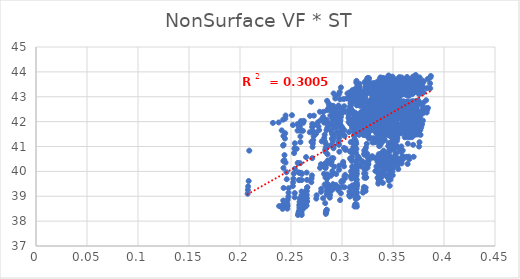
| Category | UTCI |
|---|---|
| 0.257492509 | 41.801 |
| 0.299658985 | 42.354 |
| 0.308668008 | 42.436 |
| 0.333991812 | 42.552 |
| 0.334005022 | 42.621 |
| 0.349032167 | 42.715 |
| 0.353064694 | 42.77 |
| 0.360514758 | 42.775 |
| 0.362632929 | 42.787 |
| 0.367941348 | 42.786 |
| 0.368754112 | 42.8 |
| 0.253583228 | 40.906 |
| 0.307814776 | 41.915 |
| 0.3156543 | 42.115 |
| 0.33925222 | 42.474 |
| 0.342842904 | 42.911 |
| 0.352889126 | 43.022 |
| 0.357614828 | 43.104 |
| 0.36553071 | 43.135 |
| 0.367615315 | 43.232 |
| 0.373221646 | 43.233 |
| 0.374032966 | 43.259 |
| 0.257173348 | 40.328 |
| 0.312163994 | 41.163 |
| 0.319972413 | 41.752 |
| 0.34377499 | 42.249 |
| 0.347386096 | 42.954 |
| 0.352988457 | 43.087 |
| 0.357318038 | 43.181 |
| 0.366153155 | 43.562 |
| 0.368505809 | 43.586 |
| 0.374187117 | 43.605 |
| 0.375112813 | 43.638 |
| 0.258067497 | 39.941 |
| 0.313315044 | 40.753 |
| 0.321134539 | 41.462 |
| 0.345052604 | 41.677 |
| 0.348715478 | 42.173 |
| 0.352353581 | 42.326 |
| 0.356972018 | 42.743 |
| 0.365457134 | 43.111 |
| 0.368505725 | 43.162 |
| 0.374200712 | 43.194 |
| 0.375543646 | 43.397 |
| 0.258360912 | 39.65 |
| 0.313702312 | 40.148 |
| 0.32185106 | 40.839 |
| 0.345881758 | 41.442 |
| 0.349559935 | 41.636 |
| 0.35155101 | 41.829 |
| 0.356420317 | 42.291 |
| 0.365209796 | 42.379 |
| 0.368041424 | 42.444 |
| 0.373923448 | 42.779 |
| 0.375127217 | 43.118 |
| 0.258470563 | 38.899 |
| 0.313885413 | 39.919 |
| 0.321856447 | 40.321 |
| 0.346000508 | 40.58 |
| 0.350049134 | 41.447 |
| 0.35030018 | 41.664 |
| 0.355313614 | 41.808 |
| 0.364295716 | 42.223 |
| 0.367305154 | 42.318 |
| 0.373335026 | 42.383 |
| 0.375335762 | 42.71 |
| 0.258385911 | 38.765 |
| 0.31384462 | 39.451 |
| 0.321878296 | 40.1 |
| 0.346028604 | 40.396 |
| 0.34976655 | 41.278 |
| 0.349816971 | 41.495 |
| 0.354799812 | 41.667 |
| 0.363920944 | 41.762 |
| 0.367078072 | 42.188 |
| 0.373344168 | 42.239 |
| 0.374790344 | 42.303 |
| 0.258107572 | 38.645 |
| 0.313629624 | 39.325 |
| 0.321721418 | 39.914 |
| 0.345866824 | 40.198 |
| 0.349651119 | 40.457 |
| 0.34874629 | 41.036 |
| 0.353797194 | 41.522 |
| 0.362864288 | 41.642 |
| 0.36617926 | 41.741 |
| 0.373217629 | 41.837 |
| 0.374826046 | 42.202 |
| 0.258189335 | 38.536 |
| 0.313815375 | 39.177 |
| 0.321992024 | 39.746 |
| 0.346323892 | 40.015 |
| 0.350125874 | 40.269 |
| 0.347694798 | 40.516 |
| 0.352722118 | 41.062 |
| 0.362586445 | 41.508 |
| 0.365931285 | 41.613 |
| 0.372392772 | 41.707 |
| 0.374081781 | 41.798 |
| 0.257749861 | 38.405 |
| 0.313365445 | 39.055 |
| 0.321550183 | 39.37 |
| 0.34592566 | 39.889 |
| 0.349903716 | 40.124 |
| 0.346561577 | 40.391 |
| 0.352491884 | 40.571 |
| 0.361556471 | 41.369 |
| 0.36507385 | 41.492 |
| 0.371515312 | 41.584 |
| 0.373353308 | 41.675 |
| 0.257294548 | 38.334 |
| 0.312830522 | 38.674 |
| 0.321087743 | 39.249 |
| 0.34548002 | 39.739 |
| 0.349457859 | 39.994 |
| 0.345655683 | 40.232 |
| 0.351540038 | 40.455 |
| 0.360673828 | 40.588 |
| 0.364121758 | 41.375 |
| 0.370665746 | 41.482 |
| 0.372501362 | 41.572 |
| 0.256792868 | 38.247 |
| 0.312298971 | 38.587 |
| 0.320558107 | 39.146 |
| 0.345706434 | 39.629 |
| 0.349742322 | 39.843 |
| 0.344690361 | 40.092 |
| 0.350640959 | 40.321 |
| 0.359777236 | 40.488 |
| 0.363298297 | 40.587 |
| 0.369788562 | 41.068 |
| 0.371619828 | 41.473 |
| 0.232295222 | 41.948 |
| 0.302719639 | 42.397 |
| 0.293934162 | 42.508 |
| 0.321369445 | 42.576 |
| 0.356761006 | 42.635 |
| 0.318761741 | 42.716 |
| 0.336884256 | 42.768 |
| 0.3533098 | 42.78 |
| 0.349502903 | 42.79 |
| 0.347068938 | 42.791 |
| 0.359856882 | 42.802 |
| 0.270047875 | 41.188 |
| 0.298206433 | 41.885 |
| 0.278270275 | 42.396 |
| 0.315805869 | 42.662 |
| 0.350101791 | 43.052 |
| 0.322575551 | 43.035 |
| 0.341203528 | 43.461 |
| 0.350964868 | 43.497 |
| 0.354249622 | 43.513 |
| 0.352008801 | 43.521 |
| 0.36497975 | 43.545 |
| 0.256591888 | 40.34 |
| 0.308561654 | 41.174 |
| 0.282022485 | 42.086 |
| 0.31996975 | 42.274 |
| 0.36223459 | 42.68 |
| 0.322419989 | 43.098 |
| 0.340951477 | 43.359 |
| 0.351604044 | 43.41 |
| 0.355091011 | 43.597 |
| 0.345694482 | 43.621 |
| 0.36597205 | 43.643 |
| 0.257474472 | 39.96 |
| 0.309645365 | 40.841 |
| 0.283030044 | 41.474 |
| 0.32783368 | 42.02 |
| 0.363596541 | 42.2 |
| 0.334210386 | 42.35 |
| 0.333732427 | 42.751 |
| 0.350941533 | 43.114 |
| 0.355119129 | 43.17 |
| 0.352906041 | 43.367 |
| 0.354651536 | 43.401 |
| 0.257728104 | 39.649 |
| 0.309990313 | 40.188 |
| 0.283621197 | 40.866 |
| 0.340659956 | 41.471 |
| 0.364433658 | 41.679 |
| 0.333423175 | 42.147 |
| 0.333278558 | 42.301 |
| 0.350762863 | 42.398 |
| 0.354685663 | 42.733 |
| 0.345486128 | 43.085 |
| 0.354249757 | 43.136 |
| 0.263193536 | 39.145 |
| 0.310184155 | 39.947 |
| 0.30114914 | 40.329 |
| 0.341105938 | 41.274 |
| 0.364934375 | 41.482 |
| 0.332269959 | 41.686 |
| 0.339191283 | 41.832 |
| 0.349920697 | 42.239 |
| 0.354033006 | 42.327 |
| 0.34497352 | 42.399 |
| 0.354482679 | 42.72 |
| 0.275108239 | 39.038 |
| 0.310153093 | 39.991 |
| 0.301176611 | 40.379 |
| 0.340781105 | 40.681 |
| 0.341941199 | 41.594 |
| 0.331848888 | 41.78 |
| 0.331867651 | 41.959 |
| 0.349603839 | 42.36 |
| 0.353825481 | 42.46 |
| 0.345030205 | 42.519 |
| 0.354005293 | 42.605 |
| 0.274819928 | 38.906 |
| 0.299315472 | 39.582 |
| 0.283501317 | 40.195 |
| 0.340623871 | 40.5 |
| 0.364528871 | 41.117 |
| 0.330809919 | 41.335 |
| 0.330852211 | 41.808 |
| 0.348600795 | 41.928 |
| 0.353004009 | 42.032 |
| 0.344963583 | 42.427 |
| 0.354075175 | 42.495 |
| 0.262959484 | 38.804 |
| 0.310140513 | 39.436 |
| 0.283760816 | 39.756 |
| 0.341072845 | 40.31 |
| 0.34229582 | 40.595 |
| 0.329833761 | 41.162 |
| 0.354002414 | 41.361 |
| 0.348373515 | 41.791 |
| 0.352797245 | 41.89 |
| 0.344218936 | 41.994 |
| 0.365112114 | 42.091 |
| 0.262543185 | 38.681 |
| 0.309733925 | 39.056 |
| 0.300904419 | 39.596 |
| 0.340706087 | 40.187 |
| 0.342098021 | 40.439 |
| 0.322066785 | 40.664 |
| 0.35380121 | 41.221 |
| 0.347358089 | 41.661 |
| 0.351999552 | 41.773 |
| 0.350599049 | 41.877 |
| 0.364418361 | 41.974 |
| 0.238350994 | 38.605 |
| 0.315662805 | 38.942 |
| 0.283003835 | 39.472 |
| 0.34028679 | 40.037 |
| 0.364342946 | 40.297 |
| 0.346641136 | 40.518 |
| 0.35283717 | 40.727 |
| 0.346521676 | 40.874 |
| 0.351105617 | 41.66 |
| 0.361822627 | 41.768 |
| 0.363637142 | 41.874 |
| 0.26160361 | 38.505 |
| 0.298131821 | 38.845 |
| 0.300035786 | 39.38 |
| 0.340539559 | 39.916 |
| 0.341977027 | 40.168 |
| 0.320354974 | 40.366 |
| 0.351936113 | 40.599 |
| 0.345688351 | 40.763 |
| 0.350360834 | 41.234 |
| 0.341899476 | 41.659 |
| 0.351161836 | 41.762 |
| 0.28955964 | 41.962 |
| 0.313821245 | 42.174 |
| 0.34724115 | 42.522 |
| 0.345709719 | 42.381 |
| 0.353473755 | 42.655 |
| 0.346774693 | 42.726 |
| 0.362323765 | 42.787 |
| 0.348381638 | 42.792 |
| 0.373106593 | 42.803 |
| 0.360418107 | 42.805 |
| 0.364294267 | 42.815 |
| 0.274699837 | 41.531 |
| 0.308778015 | 41.976 |
| 0.341378299 | 42.713 |
| 0.339415585 | 42.971 |
| 0.346585661 | 43.244 |
| 0.350674513 | 43.341 |
| 0.366933898 | 43.494 |
| 0.352876747 | 43.517 |
| 0.378058199 | 43.533 |
| 0.36542187 | 43.545 |
| 0.369350883 | 43.569 |
| 0.278453314 | 40.141 |
| 0.312988522 | 41.595 |
| 0.345842074 | 41.862 |
| 0.343796594 | 42.054 |
| 0.351147298 | 42.767 |
| 0.350599955 | 42.871 |
| 0.367062908 | 43.137 |
| 0.353505738 | 43.338 |
| 0.379118088 | 43.366 |
| 0.345648896 | 43.383 |
| 0.370444075 | 43.482 |
| 0.279333678 | 40.286 |
| 0.314016116 | 41.111 |
| 0.346980042 | 41.81 |
| 0.338038566 | 42.347 |
| 0.352222005 | 42.537 |
| 0.343090866 | 42.97 |
| 0.330162357 | 43.374 |
| 0.352905504 | 43.588 |
| 0.378996283 | 43.648 |
| 0.366640382 | 43.69 |
| 0.372495808 | 43.714 |
| 0.285284372 | 39.702 |
| 0.308265507 | 40.81 |
| 0.347645564 | 41.56 |
| 0.345643919 | 41.809 |
| 0.352948646 | 42.312 |
| 0.342380262 | 42.487 |
| 0.329783941 | 42.631 |
| 0.352807371 | 43.302 |
| 0.378631994 | 43.363 |
| 0.345484208 | 43.401 |
| 0.372615337 | 43.613 |
| 0.285408076 | 39.431 |
| 0.314513254 | 40.292 |
| 0.347997979 | 40.956 |
| 0.34604366 | 41.61 |
| 0.353385484 | 41.827 |
| 0.341134251 | 42.321 |
| 0.365068355 | 42.483 |
| 0.352112668 | 42.572 |
| 0.35258893 | 42.646 |
| 0.345078605 | 43.023 |
| 0.371841842 | 43.355 |
| 0.279702792 | 39.301 |
| 0.308258377 | 39.8 |
| 0.347661486 | 40.433 |
| 0.345741225 | 40.777 |
| 0.354426172 | 41.662 |
| 0.34073143 | 42.171 |
| 0.328547343 | 42.032 |
| 0.351843939 | 42.435 |
| 0.352556254 | 42.532 |
| 0.345223325 | 42.595 |
| 0.372083118 | 42.659 |
| 0.279500967 | 39.176 |
| 0.314398852 | 39.903 |
| 0.347581048 | 39.999 |
| 0.345635559 | 40.573 |
| 0.35303259 | 41.495 |
| 0.339713391 | 41.713 |
| 0.327627419 | 41.898 |
| 0.350953112 | 42.301 |
| 0.351782769 | 42.41 |
| 0.345292687 | 42.505 |
| 0.372273358 | 42.565 |
| 0.285387802 | 39.07 |
| 0.314696508 | 39.46 |
| 0.34798261 | 39.838 |
| 0.346169666 | 40.377 |
| 0.354388938 | 40.978 |
| 0.338715858 | 41.253 |
| 0.326626262 | 41.745 |
| 0.350800816 | 41.876 |
| 0.351646093 | 42.277 |
| 0.344676237 | 42.374 |
| 0.360505899 | 42.482 |
| 0.285017623 | 38.455 |
| 0.314366393 | 39.347 |
| 0.347641211 | 39.673 |
| 0.345874393 | 40.279 |
| 0.354262045 | 40.519 |
| 0.337648372 | 41.066 |
| 0.326481632 | 41.319 |
| 0.34987854 | 41.749 |
| 0.376284809 | 41.855 |
| 0.364495613 | 41.949 |
| 0.359977836 | 42.358 |
| 0.284623534 | 38.386 |
| 0.307695585 | 38.987 |
| 0.340082943 | 39.534 |
| 0.345574421 | 40.136 |
| 0.353100418 | 40.368 |
| 0.336784728 | 40.6 |
| 0.34068186 | 40.836 |
| 0.349066158 | 41.62 |
| 0.375398925 | 41.757 |
| 0.356468994 | 41.852 |
| 0.368595081 | 42.255 |
| 0.284200804 | 38.29 |
| 0.313527334 | 38.889 |
| 0.346816815 | 39.42 |
| 0.338261494 | 39.737 |
| 0.3535298 | 40.263 |
| 0.33588065 | 40.46 |
| 0.324811762 | 40.703 |
| 0.348200049 | 40.858 |
| 0.374655825 | 41.622 |
| 0.342544229 | 41.753 |
| 0.369599935 | 41.861 |
| 0.26253657 | 42.032 |
| 0.298270103 | 42.239 |
| 0.331703823 | 42.333 |
| 0.327746873 | 42.405 |
| 0.34289926 | 42.465 |
| 0.33555503 | 42.544 |
| 0.353347398 | 42.596 |
| 0.333597777 | 42.607 |
| 0.335428821 | 42.611 |
| 0.365058617 | 42.611 |
| 0.358301155 | 42.623 |
| 0.256412237 | 41.637 |
| 0.292794583 | 42.156 |
| 0.304971485 | 42.93 |
| 0.320981642 | 42.973 |
| 0.335449258 | 43.355 |
| 0.339439909 | 43.174 |
| 0.357622871 | 43.53 |
| 0.349503571 | 43.555 |
| 0.339721583 | 43.573 |
| 0.369764705 | 43.58 |
| 0.362922015 | 43.598 |
| 0.283279168 | 41.201 |
| 0.290287871 | 41.951 |
| 0.308670396 | 42.531 |
| 0.324922789 | 43.14 |
| 0.328021145 | 43.265 |
| 0.339194191 | 43.456 |
| 0.357711479 | 43.698 |
| 0.350178815 | 43.736 |
| 0.340362068 | 43.758 |
| 0.358477993 | 43.775 |
| 0.363765223 | 43.793 |
| 0.283960422 | 40.169 |
| 0.297045124 | 41.068 |
| 0.3094166 | 41.973 |
| 0.332546677 | 42.201 |
| 0.328736668 | 42.801 |
| 0.35277214 | 43.25 |
| 0.355612253 | 43.36 |
| 0.349784753 | 43.415 |
| 0.340484835 | 43.454 |
| 0.370624513 | 43.548 |
| 0.356717531 | 43.73 |
| 0.260591054 | 39.892 |
| 0.297394447 | 40.79 |
| 0.30984027 | 41.749 |
| 0.326065486 | 41.984 |
| 0.329201533 | 42.186 |
| 0.35213682 | 42.627 |
| 0.35530882 | 43.043 |
| 0.349342563 | 43.306 |
| 0.339873763 | 43.345 |
| 0.35846444 | 43.388 |
| 0.35648632 | 43.424 |
| 0.26599313 | 39.363 |
| 0.291529205 | 40.528 |
| 0.303395291 | 40.863 |
| 0.326329516 | 41.811 |
| 0.329463353 | 42.003 |
| 0.350917497 | 42.219 |
| 0.355907109 | 42.338 |
| 0.348718092 | 42.998 |
| 0.343727873 | 43.24 |
| 0.357587926 | 43.308 |
| 0.356359802 | 43.333 |
| 0.260391355 | 39.19 |
| 0.297204201 | 40.229 |
| 0.30348438 | 40.913 |
| 0.326428423 | 41.586 |
| 0.337975721 | 42.127 |
| 0.350422931 | 42.325 |
| 0.354033489 | 42.49 |
| 0.348591844 | 42.569 |
| 0.343786058 | 42.649 |
| 0.357809047 | 43.143 |
| 0.356045907 | 43.508 |
| 0.260239712 | 39.032 |
| 0.297096884 | 40.065 |
| 0.309564195 | 40.424 |
| 0.326364868 | 41.412 |
| 0.329579202 | 41.659 |
| 0.349321422 | 41.874 |
| 0.353106854 | 42.346 |
| 0.347710582 | 42.457 |
| 0.343196545 | 42.547 |
| 0.357293489 | 42.625 |
| 0.35559145 | 42.958 |
| 0.265507076 | 38.918 |
| 0.29079141 | 39.907 |
| 0.309339365 | 40 |
| 0.325675406 | 40.56 |
| 0.337894315 | 41.504 |
| 0.348267269 | 41.73 |
| 0.335327772 | 42.216 |
| 0.347656238 | 42.345 |
| 0.343148218 | 42.435 |
| 0.357447597 | 42.528 |
| 0.355972212 | 42.607 |
| 0.265729156 | 38.795 |
| 0.291132637 | 39.487 |
| 0.303083778 | 39.856 |
| 0.326095662 | 40.426 |
| 0.337806039 | 40.708 |
| 0.347163503 | 41.606 |
| 0.335143578 | 41.782 |
| 0.34682243 | 42.223 |
| 0.338164095 | 42.328 |
| 0.368916423 | 42.424 |
| 0.355550787 | 42.514 |
| 0.283524919 | 38.722 |
| 0.296836453 | 39.35 |
| 0.302840204 | 39.722 |
| 0.325876543 | 40.289 |
| 0.329129426 | 40.548 |
| 0.339178692 | 41.168 |
| 0.352338498 | 41.666 |
| 0.346068996 | 42.11 |
| 0.337458585 | 42.228 |
| 0.36825463 | 42.331 |
| 0.362223614 | 42.419 |
| 0.265135599 | 38.63 |
| 0.296538533 | 39.233 |
| 0.30250936 | 39.361 |
| 0.313098166 | 40.18 |
| 0.337282242 | 40.409 |
| 0.345331451 | 41.017 |
| 0.333430154 | 41.543 |
| 0.345295606 | 41.704 |
| 0.336873822 | 42.108 |
| 0.355520368 | 42.226 |
| 0.354210199 | 42.325 |
| 0.259691097 | 42.021 |
| 0.316547472 | 41.854 |
| 0.336066938 | 42.279 |
| 0.314732278 | 41.96 |
| 0.36241954 | 42.429 |
| 0.326402612 | 42.481 |
| 0.33384053 | 42.537 |
| 0.33557075 | 42.539 |
| 0.382207967 | 42.54 |
| 0.34134478 | 42.541 |
| 0.341402993 | 42.558 |
| 0.244715533 | 42.246 |
| 0.311401427 | 42.128 |
| 0.288578735 | 42.243 |
| 0.309121348 | 43.008 |
| 0.355670531 | 43.16 |
| 0.329841317 | 43.231 |
| 0.337730283 | 43.306 |
| 0.369512241 | 43.325 |
| 0.386516526 | 43.341 |
| 0.345213072 | 43.337 |
| 0.345259796 | 43.357 |
| 0.242323637 | 41.037 |
| 0.288961366 | 42.44 |
| 0.291747184 | 43.132 |
| 0.312435319 | 43.302 |
| 0.317219597 | 43.411 |
| 0.329540247 | 43.541 |
| 0.337710948 | 43.776 |
| 0.369727682 | 43.81 |
| 0.38710055 | 43.834 |
| 0.345654774 | 43.835 |
| 0.345684515 | 43.855 |
| 0.242522461 | 40.417 |
| 0.289233505 | 41.894 |
| 0.292129691 | 42.3 |
| 0.319356078 | 43.118 |
| 0.31765027 | 43.288 |
| 0.328733995 | 43.435 |
| 0.331355047 | 43.548 |
| 0.369474894 | 43.747 |
| 0.386694811 | 43.772 |
| 0.345669118 | 43.786 |
| 0.349474133 | 43.808 |
| 0.242589502 | 40.137 |
| 0.289289945 | 41.63 |
| 0.292100438 | 41.946 |
| 0.313017821 | 42.315 |
| 0.317828021 | 43.13 |
| 0.327609379 | 43.31 |
| 0.330671944 | 43.438 |
| 0.368595233 | 43.506 |
| 0.386379772 | 43.537 |
| 0.345158278 | 43.563 |
| 0.349405626 | 43.753 |
| 0.247625658 | 39.323 |
| 0.289272604 | 41.051 |
| 0.294988365 | 41.777 |
| 0.312866117 | 42.005 |
| 0.317897817 | 42.357 |
| 0.326965142 | 43.212 |
| 0.335717587 | 43.318 |
| 0.367923949 | 43.402 |
| 0.33551201 | 43.463 |
| 0.34483979 | 43.501 |
| 0.349256123 | 43.519 |
| 0.247541767 | 39.143 |
| 0.289184274 | 40.299 |
| 0.294927456 | 41.591 |
| 0.312785838 | 41.86 |
| 0.34068013 | 42.116 |
| 0.325896462 | 42.807 |
| 0.329631767 | 43.251 |
| 0.367849393 | 43.296 |
| 0.335010767 | 43.373 |
| 0.344434063 | 43.404 |
| 0.348420779 | 43.45 |
| 0.247403286 | 38.979 |
| 0.289033922 | 39.822 |
| 0.291887774 | 41.41 |
| 0.312626694 | 41.71 |
| 0.317425465 | 41.948 |
| 0.32546795 | 42.399 |
| 0.32882346 | 42.57 |
| 0.367081155 | 43.231 |
| 0.334473332 | 43.286 |
| 0.343958071 | 43.342 |
| 0.347982855 | 43.378 |
| 0.246711322 | 38.855 |
| 0.288819138 | 39.364 |
| 0.291658002 | 40.929 |
| 0.312488006 | 41.538 |
| 0.340368653 | 41.84 |
| 0.32449788 | 42.114 |
| 0.330803425 | 42.453 |
| 0.366346044 | 42.567 |
| 0.333842087 | 43.206 |
| 0.343413339 | 43.263 |
| 0.346085381 | 43.319 |
| 0.246405623 | 38.704 |
| 0.288575682 | 39.212 |
| 0.294315952 | 39.894 |
| 0.312213794 | 41.426 |
| 0.340210722 | 41.711 |
| 0.323423537 | 42.02 |
| 0.329952988 | 42.2 |
| 0.365506402 | 42.467 |
| 0.384233244 | 42.55 |
| 0.343641158 | 42.896 |
| 0.346461561 | 43.247 |
| 0.246677598 | 38.613 |
| 0.288270035 | 39.059 |
| 0.294073097 | 39.451 |
| 0.311983694 | 40.962 |
| 0.316811912 | 41.551 |
| 0.322555523 | 41.895 |
| 0.329059395 | 42.104 |
| 0.365579975 | 42.377 |
| 0.383529981 | 42.477 |
| 0.343139499 | 42.551 |
| 0.343662437 | 42.901 |
| 0.24643087 | 38.501 |
| 0.288003079 | 38.943 |
| 0.293787223 | 39.346 |
| 0.318179716 | 40.203 |
| 0.339628243 | 41.454 |
| 0.321656238 | 41.771 |
| 0.328233087 | 41.994 |
| 0.364815573 | 42.298 |
| 0.382983969 | 42.366 |
| 0.342627801 | 42.46 |
| 0.346874654 | 42.546 |
| 0.277520435 | 41.661 |
| 0.287359184 | 41.851 |
| 0.29483771 | 41.919 |
| 0.328617458 | 41.981 |
| 0.329987797 | 42.038 |
| 0.31661996 | 42.123 |
| 0.314835918 | 42.17 |
| 0.32516471 | 42.17 |
| 0.351871875 | 42.17 |
| 0.323384191 | 42.173 |
| 0.354677876 | 42.185 |
| 0.251882055 | 41.864 |
| 0.283747511 | 42.043 |
| 0.305816163 | 42.437 |
| 0.324201103 | 42.237 |
| 0.325377951 | 42.602 |
| 0.319761178 | 42.426 |
| 0.317981768 | 42.763 |
| 0.34787274 | 42.778 |
| 0.35523831 | 42.791 |
| 0.326410725 | 42.786 |
| 0.357980569 | 42.797 |
| 0.259493486 | 41.941 |
| 0.292304557 | 42.294 |
| 0.287493929 | 42.639 |
| 0.327123999 | 42.763 |
| 0.330778414 | 42.863 |
| 0.3192981 | 42.962 |
| 0.317662483 | 43.027 |
| 0.347843444 | 43.058 |
| 0.355299492 | 43.065 |
| 0.34552734 | 43.068 |
| 0.35791283 | 43.076 |
| 0.259449707 | 41.635 |
| 0.296589875 | 42.647 |
| 0.308567877 | 42.868 |
| 0.313729491 | 43.021 |
| 0.330734962 | 43.156 |
| 0.330592527 | 43.435 |
| 0.317044958 | 43.519 |
| 0.347322022 | 43.554 |
| 0.354874787 | 43.565 |
| 0.32592277 | 43.571 |
| 0.357635608 | 43.592 |
| 0.259242214 | 41.404 |
| 0.296344461 | 42.189 |
| 0.308347004 | 42.736 |
| 0.307754625 | 42.906 |
| 0.330505999 | 43.05 |
| 0.328959923 | 43.184 |
| 0.31635528 | 43.29 |
| 0.346451126 | 43.506 |
| 0.354401329 | 43.514 |
| 0.344778985 | 43.533 |
| 0.357049361 | 43.55 |
| 0.253747866 | 41.13 |
| 0.291807319 | 41.757 |
| 0.31465391 | 42.812 |
| 0.307551294 | 43.021 |
| 0.330263687 | 43.17 |
| 0.328316608 | 43.336 |
| 0.315040774 | 43.427 |
| 0.345807658 | 43.484 |
| 0.346786259 | 43.679 |
| 0.344335346 | 43.711 |
| 0.356664156 | 43.721 |
| 0.253553498 | 40.931 |
| 0.285626419 | 41.751 |
| 0.314428168 | 42.658 |
| 0.307315283 | 43.175 |
| 0.329985064 | 43.364 |
| 0.327250436 | 43.52 |
| 0.314185375 | 43.639 |
| 0.345047969 | 43.688 |
| 0.346215245 | 43.728 |
| 0.343861709 | 43.745 |
| 0.356215635 | 43.789 |
| 0.253012572 | 40.735 |
| 0.291348691 | 41.346 |
| 0.286574045 | 42.524 |
| 0.307043405 | 43.068 |
| 0.329743299 | 43.257 |
| 0.326188359 | 43.434 |
| 0.314008171 | 43.569 |
| 0.34427035 | 43.639 |
| 0.345067084 | 43.676 |
| 0.343364628 | 43.72 |
| 0.355730086 | 43.743 |
| 0.252694682 | 39.908 |
| 0.291073062 | 41.205 |
| 0.286319207 | 41.836 |
| 0.306851469 | 42.915 |
| 0.329488367 | 43.172 |
| 0.325908215 | 43.343 |
| 0.331454214 | 43.489 |
| 0.343578724 | 43.576 |
| 0.344349942 | 43.62 |
| 0.34285274 | 43.669 |
| 0.35563229 | 43.715 |
| 0.252372595 | 39.702 |
| 0.290314408 | 41.049 |
| 0.313592794 | 41.703 |
| 0.306551906 | 42.262 |
| 0.329285345 | 43.072 |
| 0.312900985 | 43.279 |
| 0.330690533 | 43.425 |
| 0.335671587 | 43.519 |
| 0.350820494 | 43.571 |
| 0.323237815 | 43.621 |
| 0.355245213 | 43.669 |
| 0.252077797 | 39.558 |
| 0.289972688 | 40.532 |
| 0.298389929 | 41.588 |
| 0.306321104 | 42.149 |
| 0.328977101 | 42.38 |
| 0.312080973 | 43.19 |
| 0.32988649 | 43.362 |
| 0.342177492 | 43.454 |
| 0.350164028 | 43.535 |
| 0.322027927 | 43.578 |
| 0.354338056 | 43.628 |
| 0.251805083 | 39.41 |
| 0.289663275 | 40.388 |
| 0.313042246 | 41.216 |
| 0.318257349 | 42.051 |
| 0.328716508 | 42.287 |
| 0.311200037 | 42.809 |
| 0.329153854 | 43.288 |
| 0.334428191 | 43.403 |
| 0.349638063 | 43.449 |
| 0.340526033 | 43.535 |
| 0.353801856 | 43.585 |
| 0.271526175 | 41.628 |
| 0.298370754 | 41.867 |
| 0.319207171 | 41.869 |
| 0.328472838 | 41.959 |
| 0.335980186 | 42.01 |
| 0.336986358 | 42.083 |
| 0.340818695 | 42.15 |
| 0.342948847 | 42.146 |
| 0.34601295 | 42.151 |
| 0.347416206 | 42.147 |
| 0.349322764 | 42.163 |
| 0.270705837 | 41.783 |
| 0.297282781 | 41.841 |
| 0.317964328 | 42.234 |
| 0.326428496 | 42.317 |
| 0.334926735 | 42.41 |
| 0.340023584 | 42.489 |
| 0.343763914 | 42.568 |
| 0.345833414 | 42.569 |
| 0.348834017 | 42.594 |
| 0.350238257 | 42.587 |
| 0.352121265 | 42.592 |
| 0.272874839 | 41.525 |
| 0.29965746 | 41.684 |
| 0.320481481 | 42.288 |
| 0.328994987 | 42.215 |
| 0.334428992 | 42.599 |
| 0.339620842 | 42.449 |
| 0.343449727 | 42.746 |
| 0.345607107 | 42.557 |
| 0.348531273 | 42.769 |
| 0.349854261 | 42.555 |
| 0.35174 | 42.778 |
| 0.272586279 | 41.859 |
| 0.299330942 | 42.305 |
| 0.320136589 | 42.742 |
| 0.328646551 | 42.899 |
| 0.333139764 | 43.009 |
| 0.338834977 | 43.178 |
| 0.342723863 | 43.282 |
| 0.344962001 | 43.29 |
| 0.347970734 | 43.296 |
| 0.349350444 | 43.304 |
| 0.35121758 | 43.325 |
| 0.272137262 | 41.417 |
| 0.298875474 | 42.185 |
| 0.319655739 | 42.336 |
| 0.328150837 | 42.816 |
| 0.331891768 | 42.933 |
| 0.337726322 | 43.037 |
| 0.342038673 | 43.151 |
| 0.344324477 | 43.274 |
| 0.347433772 | 43.276 |
| 0.348837995 | 43.278 |
| 0.350707988 | 43.291 |
| 0.271791315 | 41.26 |
| 0.298452887 | 42.057 |
| 0.318813559 | 42.259 |
| 0.327686567 | 42.448 |
| 0.330644578 | 42.879 |
| 0.336777418 | 43.016 |
| 0.341387456 | 43.109 |
| 0.3437008 | 43.139 |
| 0.346949891 | 43.161 |
| 0.348399199 | 43.197 |
| 0.350283319 | 43.281 |
| 0.271435509 | 41.126 |
| 0.298085876 | 41.934 |
| 0.318427269 | 42.148 |
| 0.32727129 | 42.386 |
| 0.32951357 | 42.845 |
| 0.335911383 | 42.985 |
| 0.340655494 | 43.09 |
| 0.343052607 | 43.098 |
| 0.34604376 | 43.128 |
| 0.347955252 | 43.146 |
| 0.349872239 | 43.25 |
| 0.271144747 | 40.982 |
| 0.297764938 | 41.835 |
| 0.318443023 | 42.062 |
| 0.326904046 | 42.306 |
| 0.328416421 | 42.462 |
| 0.33504986 | 42.934 |
| 0.33993136 | 43.063 |
| 0.342464792 | 43.084 |
| 0.345477233 | 43.101 |
| 0.347496864 | 43.134 |
| 0.349426981 | 43.224 |
| 0.270812593 | 40.531 |
| 0.297421532 | 41.464 |
| 0.318150002 | 41.969 |
| 0.326561389 | 42.21 |
| 0.327405735 | 42.393 |
| 0.334212677 | 42.544 |
| 0.338636554 | 42.69 |
| 0.341789706 | 43.046 |
| 0.344926498 | 43.073 |
| 0.347004877 | 43.106 |
| 0.348982834 | 43.221 |
| 0.270520387 | 39.839 |
| 0.297066916 | 41.34 |
| 0.317366148 | 41.875 |
| 0.326293333 | 42.169 |
| 0.327084271 | 42.335 |
| 0.333420528 | 42.522 |
| 0.337870397 | 42.652 |
| 0.341268311 | 43.021 |
| 0.344374468 | 43.035 |
| 0.346023287 | 43.078 |
| 0.348587331 | 43.19 |
| 0.270193458 | 39.718 |
| 0.296779515 | 41.21 |
| 0.317480143 | 41.527 |
| 0.325916732 | 42.094 |
| 0.326264671 | 42.256 |
| 0.332604906 | 42.453 |
| 0.337226999 | 42.618 |
| 0.340654432 | 42.82 |
| 0.343842821 | 43.027 |
| 0.345512681 | 43.054 |
| 0.348217123 | 43.164 |
| 0.269919552 | 39.565 |
| 0.29646385 | 41.1 |
| 0.316757746 | 41.469 |
| 0.325620829 | 41.756 |
| 0.324612434 | 42.207 |
| 0.331861964 | 42.382 |
| 0.336594791 | 42.571 |
| 0.340189974 | 42.784 |
| 0.343333762 | 42.973 |
| 0.344973943 | 43.029 |
| 0.347820714 | 43.139 |
| 0.240888601 | 41.646 |
| 0.27081963 | 41.902 |
| 0.276379639 | 41.975 |
| 0.308486905 | 42.038 |
| 0.314038922 | 42.096 |
| 0.328915833 | 42.18 |
| 0.328083625 | 42.231 |
| 0.348411213 | 42.23 |
| 0.343734464 | 42.23 |
| 0.334766698 | 42.235 |
| 0.343033869 | 42.249 |
| 0.242337395 | 42.079 |
| 0.272435111 | 42.24 |
| 0.29134304 | 42.636 |
| 0.310200278 | 42.44 |
| 0.317076874 | 42.87 |
| 0.332053207 | 42.696 |
| 0.331101119 | 43.039 |
| 0.351557796 | 43.051 |
| 0.346614427 | 43.064 |
| 0.337692322 | 43.06 |
| 0.345994567 | 43.069 |
| 0.244428541 | 42.124 |
| 0.285488823 | 42.461 |
| 0.269697962 | 42.8 |
| 0.312821493 | 42.921 |
| 0.315246986 | 43.022 |
| 0.331708088 | 43.116 |
| 0.331009409 | 43.185 |
| 0.351539198 | 43.284 |
| 0.34650914 | 43.29 |
| 0.344566746 | 43.292 |
| 0.345838904 | 43.298 |
| 0.24431657 | 41.534 |
| 0.285352833 | 42.836 |
| 0.293686373 | 43.047 |
| 0.319199151 | 43.185 |
| 0.314373319 | 43.314 |
| 0.342784856 | 43.595 |
| 0.347619291 | 43.686 |
| 0.351067547 | 43.716 |
| 0.346100626 | 43.724 |
| 0.337219677 | 43.729 |
| 0.326393212 | 43.75 |
| 0.244060989 | 41.32 |
| 0.285083974 | 42.068 |
| 0.293399094 | 42.931 |
| 0.318902505 | 43.089 |
| 0.312848136 | 43.222 |
| 0.342025905 | 43.345 |
| 0.346735096 | 43.454 |
| 0.350574372 | 43.673 |
| 0.345655333 | 43.679 |
| 0.34362296 | 43.697 |
| 0.32607847 | 43.71 |
| 0.209084218 | 40.834 |
| 0.284802899 | 41.656 |
| 0.293150247 | 42.501 |
| 0.318603634 | 43.011 |
| 0.312231287 | 43.148 |
| 0.340634852 | 43.303 |
| 0.329038808 | 43.389 |
| 0.350064271 | 43.437 |
| 0.345202657 | 43.639 |
| 0.343234553 | 43.668 |
| 0.325802252 | 43.676 |
| 0.243622455 | 40.655 |
| 0.273898602 | 41.485 |
| 0.292897134 | 42.356 |
| 0.318306318 | 43.185 |
| 0.298937831 | 43.374 |
| 0.339729216 | 43.516 |
| 0.345334976 | 43.632 |
| 0.349474984 | 43.663 |
| 0.344737559 | 43.702 |
| 0.342790421 | 43.716 |
| 0.325089686 | 43.756 |
| 0.243420234 | 40.454 |
| 0.284324076 | 41.099 |
| 0.268589467 | 42.233 |
| 0.318035139 | 43.086 |
| 0.310216266 | 43.267 |
| 0.339546113 | 43.442 |
| 0.344562652 | 43.574 |
| 0.348303123 | 43.622 |
| 0.344215534 | 43.657 |
| 0.342324344 | 43.695 |
| 0.324654548 | 43.714 |
| 0.208499039 | 39.612 |
| 0.284042951 | 40.953 |
| 0.268390825 | 41.575 |
| 0.317752669 | 42.636 |
| 0.297747026 | 43.189 |
| 0.338728406 | 43.355 |
| 0.326955609 | 43.5 |
| 0.347604955 | 43.567 |
| 0.343712737 | 43.606 |
| 0.341832933 | 43.65 |
| 0.354317186 | 43.693 |
| 0.207956508 | 39.395 |
| 0.283750632 | 40.788 |
| 0.292098978 | 41.447 |
| 0.317547511 | 41.988 |
| 0.29680496 | 43.095 |
| 0.337944122 | 43.294 |
| 0.326243511 | 43.439 |
| 0.347050669 | 43.516 |
| 0.343194576 | 43.561 |
| 0.334482386 | 43.602 |
| 0.353895972 | 43.65 |
| 0.207697163 | 39.253 |
| 0.283505616 | 40.325 |
| 0.29185754 | 41.328 |
| 0.31722363 | 41.882 |
| 0.308190661 | 42.107 |
| 0.337140192 | 42.901 |
| 0.325646204 | 43.375 |
| 0.34641001 | 43.448 |
| 0.342691699 | 43.521 |
| 0.340967571 | 43.564 |
| 0.342444087 | 43.61 |
| 0.207478926 | 39.101 |
| 0.282681064 | 40.178 |
| 0.291591674 | 40.974 |
| 0.316963044 | 41.796 |
| 0.29519476 | 42.016 |
| 0.336410212 | 42.509 |
| 0.32504944 | 43.304 |
| 0.345925437 | 43.4 |
| 0.341395573 | 43.443 |
| 0.340454516 | 43.519 |
| 0.323122793 | 43.568 |
| 0.237938875 | 41.967 |
| 0.276972459 | 41.805 |
| 0.291609885 | 42.3 |
| 0.306498758 | 41.981 |
| 0.358317607 | 42.447 |
| 0.348417953 | 42.511 |
| 0.3572385 | 42.561 |
| 0.335057762 | 42.564 |
| 0.368136646 | 42.564 |
| 0.379377616 | 42.569 |
| 0.37200207 | 42.584 |
| 0.250955396 | 42.259 |
| 0.279413653 | 42.069 |
| 0.28689297 | 42.732 |
| 0.308463827 | 42.945 |
| 0.362124525 | 43.089 |
| 0.352427552 | 43.179 |
| 0.361171837 | 43.239 |
| 0.368827504 | 43.335 |
| 0.372174275 | 43.35 |
| 0.383515012 | 43.347 |
| 0.37576042 | 43.366 |
| 0.24255892 | 41.421 |
| 0.3077557 | 42.605 |
| 0.309948534 | 43.095 |
| 0.311639102 | 43.224 |
| 0.339400839 | 43.325 |
| 0.35242966 | 43.468 |
| 0.361416492 | 43.702 |
| 0.369357048 | 43.736 |
| 0.372592378 | 43.76 |
| 0.344800955 | 43.757 |
| 0.376151848 | 43.776 |
| 0.242728476 | 41.068 |
| 0.28266225 | 42.078 |
| 0.290167271 | 42.632 |
| 0.339161801 | 43.058 |
| 0.338562616 | 43.216 |
| 0.323427709 | 43.369 |
| 0.323566327 | 43.469 |
| 0.369038574 | 43.676 |
| 0.372629433 | 43.7 |
| 0.383962824 | 43.714 |
| 0.339235194 | 43.74 |
| 0.253794602 | 40.102 |
| 0.282608325 | 41.345 |
| 0.290284273 | 42.153 |
| 0.312102023 | 42.327 |
| 0.337442144 | 43.07 |
| 0.322828172 | 43.257 |
| 0.322882431 | 43.376 |
| 0.368784236 | 43.433 |
| 0.372143308 | 43.459 |
| 0.344799171 | 43.489 |
| 0.339209527 | 43.514 |
| 0.24274343 | 39.333 |
| 0.307978623 | 40.793 |
| 0.290129251 | 41.508 |
| 0.312160773 | 41.724 |
| 0.336818345 | 42.367 |
| 0.322022214 | 43.166 |
| 0.359870794 | 43.269 |
| 0.368405108 | 43.339 |
| 0.332686432 | 43.395 |
| 0.344681538 | 43.431 |
| 0.339103095 | 43.448 |
| 0.253700622 | 39.128 |
| 0.307905961 | 40.515 |
| 0.290039308 | 41.308 |
| 0.311794075 | 41.587 |
| 0.350474672 | 41.954 |
| 0.32185876 | 42.772 |
| 0.322339545 | 42.918 |
| 0.367916405 | 43.244 |
| 0.332352756 | 43.313 |
| 0.343876074 | 43.343 |
| 0.338939378 | 43.379 |
| 0.253596816 | 38.958 |
| 0.282389173 | 39.899 |
| 0.309990445 | 40.752 |
| 0.31166599 | 41.43 |
| 0.335204783 | 41.672 |
| 0.321067008 | 42.361 |
| 0.321675225 | 42.815 |
| 0.367386625 | 43.18 |
| 0.331936391 | 43.234 |
| 0.343487591 | 43.289 |
| 0.33800741 | 43.321 |
| 0.242392695 | 38.827 |
| 0.307567119 | 39.364 |
| 0.309856119 | 40.583 |
| 0.311502883 | 41.25 |
| 0.348940289 | 41.532 |
| 0.320209696 | 41.777 |
| 0.364025883 | 42.102 |
| 0.366711793 | 42.516 |
| 0.331473517 | 43.156 |
| 0.343049587 | 43.215 |
| 0.346852324 | 43.266 |
| 0.242199045 | 38.669 |
| 0.307308652 | 39.187 |
| 0.289533014 | 40.407 |
| 0.311360295 | 41.127 |
| 0.347783445 | 41.408 |
| 0.326013356 | 41.692 |
| 0.363189738 | 41.859 |
| 0.366964752 | 42.118 |
| 0.370754238 | 42.502 |
| 0.382444492 | 42.86 |
| 0.347284403 | 43.198 |
| 0.24197525 | 38.588 |
| 0.307085916 | 39.04 |
| 0.309404915 | 39.973 |
| 0.311105864 | 40.972 |
| 0.332178383 | 41.264 |
| 0.318500629 | 41.561 |
| 0.320425762 | 41.777 |
| 0.366333146 | 42.037 |
| 0.370244042 | 42.439 |
| 0.350334245 | 42.504 |
| 0.374566032 | 42.857 |
| 0.241773681 | 38.493 |
| 0.281500165 | 38.919 |
| 0.289102936 | 39.855 |
| 0.310878061 | 40.196 |
| 0.345879783 | 41.135 |
| 0.324318436 | 41.433 |
| 0.362550319 | 41.664 |
| 0.365808687 | 41.964 |
| 0.369697458 | 42.028 |
| 0.342553111 | 42.425 |
| 0.337378405 | 42.5 |
| 0.256479252 | 41.902 |
| 0.281817794 | 42.394 |
| 0.298412212 | 42.545 |
| 0.302223683 | 42.618 |
| 0.309197 | 42.678 |
| 0.325058495 | 42.767 |
| 0.344607571 | 42.811 |
| 0.347533577 | 42.822 |
| 0.335422952 | 42.825 |
| 0.352768761 | 42.831 |
| 0.340760228 | 42.844 |
| 0.261720239 | 41.631 |
| 0.281542038 | 42.196 |
| 0.298067667 | 42.899 |
| 0.301793993 | 42.908 |
| 0.312795941 | 43.275 |
| 0.329022468 | 43.12 |
| 0.348725149 | 43.45 |
| 0.34453958 | 43.546 |
| 0.339630478 | 43.564 |
| 0.357178478 | 43.572 |
| 0.344948173 | 43.587 |
| 0.264760517 | 40.574 |
| 0.284828099 | 41.965 |
| 0.308454362 | 42.501 |
| 0.305340757 | 43.131 |
| 0.323395096 | 43.261 |
| 0.329148901 | 43.377 |
| 0.349450443 | 43.62 |
| 0.34522645 | 43.66 |
| 0.340393447 | 43.681 |
| 0.350506149 | 43.699 |
| 0.34573583 | 43.715 |
| 0.265367324 | 39.951 |
| 0.285476127 | 40.976 |
| 0.302176451 | 41.662 |
| 0.318289776 | 42.191 |
| 0.322841725 | 42.942 |
| 0.328626492 | 43.25 |
| 0.36449998 | 43.349 |
| 0.345347333 | 43.403 |
| 0.340455513 | 43.438 |
| 0.358325394 | 43.462 |
| 0.344676349 | 43.658 |
| 0.265647985 | 39.656 |
| 0.285818362 | 40.69 |
| 0.302539559 | 41.427 |
| 0.325330647 | 41.676 |
| 0.32217212 | 42.183 |
| 0.328353051 | 42.647 |
| 0.36405095 | 43.05 |
| 0.344772448 | 43.303 |
| 0.340442981 | 43.338 |
| 0.35068477 | 43.379 |
| 0.344523116 | 43.41 |
| 0.265841185 | 39.353 |
| 0.285996825 | 40.438 |
| 0.312747665 | 40.916 |
| 0.325572366 | 41.497 |
| 0.321081773 | 41.703 |
| 0.327425824 | 42.223 |
| 0.348045295 | 42.342 |
| 0.34431541 | 43.008 |
| 0.346539715 | 43.243 |
| 0.350599732 | 43.307 |
| 0.344491486 | 43.332 |
| 0.265534968 | 39.209 |
| 0.292325095 | 40.192 |
| 0.312855473 | 40.97 |
| 0.325671888 | 41.578 |
| 0.324179519 | 41.842 |
| 0.327120136 | 42.048 |
| 0.363243006 | 42.514 |
| 0.344333909 | 42.591 |
| 0.346778301 | 42.673 |
| 0.350304988 | 43.179 |
| 0.344310305 | 43.53 |
| 0.265438539 | 39.058 |
| 0.290564403 | 40.009 |
| 0.309736229 | 40.426 |
| 0.32568625 | 41.411 |
| 0.319605346 | 41.651 |
| 0.326201379 | 41.903 |
| 0.362350173 | 42.071 |
| 0.343749283 | 42.177 |
| 0.346239101 | 42.567 |
| 0.349909111 | 42.652 |
| 0.34395974 | 42.998 |
| 0.265230355 | 38.926 |
| 0.285410801 | 39.876 |
| 0.309093082 | 40.009 |
| 0.325613303 | 40.544 |
| 0.322771267 | 41.511 |
| 0.325319767 | 41.737 |
| 0.351793496 | 41.945 |
| 0.343689908 | 42.072 |
| 0.346420193 | 42.155 |
| 0.350137023 | 42.556 |
| 0.351453564 | 42.636 |
| 0.265558675 | 38.789 |
| 0.285769944 | 39.494 |
| 0.312589696 | 39.846 |
| 0.32554542 | 40.422 |
| 0.321692435 | 40.703 |
| 0.32444344 | 41.609 |
| 0.351642171 | 41.795 |
| 0.343054636 | 41.959 |
| 0.3389618 | 42.057 |
| 0.357165521 | 42.46 |
| 0.351071585 | 42.543 |
| 0.259743839 | 38.702 |
| 0.296551955 | 39.362 |
| 0.309319725 | 39.708 |
| 0.325297203 | 40.273 |
| 0.316743221 | 40.534 |
| 0.324264376 | 41.109 |
| 0.338130886 | 41.675 |
| 0.342303093 | 41.836 |
| 0.338314436 | 41.967 |
| 0.343994523 | 42.064 |
| 0.34493706 | 42.151 |
| 0.265018687 | 38.622 |
| 0.290230541 | 39.251 |
| 0.312122219 | 39.371 |
| 0.325065229 | 40.149 |
| 0.319981847 | 40.406 |
| 0.323448732 | 40.951 |
| 0.35007278 | 41.56 |
| 0.341681618 | 41.723 |
| 0.337688424 | 41.833 |
| 0.348536354 | 41.969 |
| 0.343058249 | 42.063 |
| 0.282470839 | 41.959 |
| 0.311336374 | 42.368 |
| 0.333289543 | 42.498 |
| 0.342393969 | 42.595 |
| 0.341666994 | 42.658 |
| 0.348469888 | 42.73 |
| 0.359270114 | 42.791 |
| 0.355573016 | 42.796 |
| 0.368116376 | 42.807 |
| 0.360362722 | 42.809 |
| 0.370318242 | 42.818 |
| 0.280165018 | 41.208 |
| 0.308802663 | 41.946 |
| 0.330368953 | 42.674 |
| 0.339221553 | 42.946 |
| 0.345373525 | 43.23 |
| 0.352854313 | 43.33 |
| 0.363796867 | 43.411 |
| 0.360119129 | 43.434 |
| 0.373052998 | 43.522 |
| 0.365198282 | 43.534 |
| 0.375192813 | 43.556 |
| 0.283835122 | 40.132 |
| 0.312668961 | 41.281 |
| 0.334448027 | 41.525 |
| 0.34349831 | 42.039 |
| 0.345267165 | 42.761 |
| 0.353010605 | 43.017 |
| 0.364379743 | 43.113 |
| 0.361133746 | 43.325 |
| 0.373930962 | 43.355 |
| 0.366219947 | 43.373 |
| 0.376287713 | 43.399 |
| 0.28469946 | 40.278 |
| 0.313623254 | 41.196 |
| 0.33546844 | 41.781 |
| 0.344442165 | 42.354 |
| 0.344665003 | 42.537 |
| 0.352425355 | 42.984 |
| 0.363711753 | 43.388 |
| 0.360986775 | 43.589 |
| 0.37423933 | 43.643 |
| 0.366490121 | 43.685 |
| 0.372297828 | 43.875 |
| 0.285129177 | 39.731 |
| 0.314163058 | 40.902 |
| 0.336091955 | 41.247 |
| 0.345082604 | 41.81 |
| 0.343929168 | 42.018 |
| 0.351985523 | 42.492 |
| 0.363601997 | 42.634 |
| 0.360625983 | 43.316 |
| 0.373715453 | 43.375 |
| 0.366549937 | 43.57 |
| 0.372444073 | 43.452 |
| 0.285127676 | 39.509 |
| 0.314473163 | 40.037 |
| 0.336458791 | 41.015 |
| 0.345464242 | 41.613 |
| 0.342754942 | 41.83 |
| 0.350898118 | 42.034 |
| 0.362782101 | 42.487 |
| 0.359997019 | 42.574 |
| 0.373234784 | 42.653 |
| 0.365774484 | 43.04 |
| 0.372391389 | 43.366 |
| 0.285102995 | 39.353 |
| 0.314157151 | 39.824 |
| 0.336168169 | 40.44 |
| 0.345655389 | 40.779 |
| 0.34224049 | 41.667 |
| 0.350483071 | 41.874 |
| 0.36252116 | 42.05 |
| 0.359938278 | 42.137 |
| 0.373347672 | 42.53 |
| 0.365993307 | 42.605 |
| 0.372123088 | 42.668 |
| 0.28498162 | 39.209 |
| 0.314047092 | 39.683 |
| 0.33604935 | 40.008 |
| 0.345100207 | 40.58 |
| 0.34114502 | 41.496 |
| 0.349513657 | 41.711 |
| 0.361530231 | 41.896 |
| 0.359124467 | 42.014 |
| 0.37267007 | 42.115 |
| 0.366130161 | 42.514 |
| 0.372364273 | 42.565 |
| 0.285243394 | 39.078 |
| 0.314413062 | 39.547 |
| 0.336538331 | 39.855 |
| 0.345601816 | 40.385 |
| 0.340085057 | 40.678 |
| 0.348498575 | 41.185 |
| 0.355242531 | 41.743 |
| 0.3589563 | 41.88 |
| 0.372664974 | 41.986 |
| 0.365539736 | 42.089 |
| 0.372301599 | 42.182 |
| 0.284946259 | 38.455 |
| 0.314099141 | 39.413 |
| 0.336263109 | 39.704 |
| 0.345474986 | 40.264 |
| 0.338977137 | 40.53 |
| 0.34826928 | 41.066 |
| 0.354268608 | 41.322 |
| 0.358194516 | 41.75 |
| 0.371905666 | 41.858 |
| 0.364974422 | 41.978 |
| 0.371772347 | 42.07 |
| 0.284532968 | 38.411 |
| 0.313755075 | 39.034 |
| 0.335960375 | 39.589 |
| 0.345130369 | 40.123 |
| 0.338135192 | 40.371 |
| 0.347306928 | 40.61 |
| 0.359540164 | 40.839 |
| 0.357342043 | 41.631 |
| 0.371111106 | 41.753 |
| 0.364219305 | 41.864 |
| 0.375046986 | 41.963 |
| 0.284144747 | 38.34 |
| 0.313327788 | 38.922 |
| 0.335563581 | 39.506 |
| 0.344794455 | 39.756 |
| 0.337247364 | 40.248 |
| 0.346413505 | 40.462 |
| 0.352621666 | 40.696 |
| 0.35659821 | 40.86 |
| 0.370323651 | 41.62 |
| 0.363445576 | 41.757 |
| 0.370075837 | 41.867 |
| 0.262028753 | 41.952 |
| 0.310322604 | 42.327 |
| 0.300519987 | 42.497 |
| 0.334438324 | 42.579 |
| 0.345508917 | 42.644 |
| 0.340355144 | 42.718 |
| 0.329969491 | 42.775 |
| 0.361283776 | 42.783 |
| 0.373625156 | 42.796 |
| 0.354739255 | 42.799 |
| 0.35024875 | 42.81 |
| 0.259249637 | 41.177 |
| 0.306894124 | 41.581 |
| 0.296225645 | 42.363 |
| 0.329334695 | 42.66 |
| 0.349426493 | 43.201 |
| 0.344794738 | 43.039 |
| 0.334572074 | 43.384 |
| 0.354104452 | 43.414 |
| 0.378956766 | 43.437 |
| 0.359820188 | 43.51 |
| 0.355190175 | 43.531 |
| 0.244656293 | 40.35 |
| 0.311037822 | 41.172 |
| 0.300134871 | 41.779 |
| 0.333649506 | 42.275 |
| 0.349310091 | 42.991 |
| 0.344560875 | 43.108 |
| 0.335218371 | 43.361 |
| 0.354977364 | 43.404 |
| 0.379993817 | 43.604 |
| 0.368704146 | 43.629 |
| 0.356434151 | 43.654 |
| 0.245529486 | 39.966 |
| 0.312176101 | 40.844 |
| 0.30126296 | 41.478 |
| 0.334920991 | 41.724 |
| 0.348716737 | 42.212 |
| 0.337126069 | 42.356 |
| 0.334592979 | 42.777 |
| 0.355069314 | 43.122 |
| 0.380036531 | 43.18 |
| 0.361331829 | 43.368 |
| 0.356849765 | 43.405 |
| 0.245845698 | 39.684 |
| 0.31287197 | 40.198 |
| 0.301945866 | 40.939 |
| 0.335712717 | 41.475 |
| 0.347994553 | 41.691 |
| 0.336706328 | 41.858 |
| 0.334457667 | 42.308 |
| 0.354658816 | 42.403 |
| 0.379853964 | 42.762 |
| 0.368848436 | 43.103 |
| 0.357030208 | 43.149 |
| 0.264383015 | 39.208 |
| 0.31290989 | 39.708 |
| 0.31465821 | 40.346 |
| 0.336221098 | 41.281 |
| 0.346784274 | 41.489 |
| 0.335670824 | 41.705 |
| 0.333659956 | 42.15 |
| 0.354016767 | 42.247 |
| 0.37927305 | 42.335 |
| 0.369140519 | 42.414 |
| 0.356980566 | 42.748 |
| 0.264364644 | 39.043 |
| 0.323775295 | 39.758 |
| 0.31440108 | 40.382 |
| 0.335958818 | 40.689 |
| 0.317392248 | 41.601 |
| 0.335239912 | 41.796 |
| 0.333343162 | 41.969 |
| 0.353817854 | 42.065 |
| 0.379349843 | 42.476 |
| 0.368631859 | 42.535 |
| 0.356652453 | 42.612 |
| 0.26421814 | 38.915 |
| 0.299791744 | 39.614 |
| 0.302000717 | 40.205 |
| 0.335875641 | 40.511 |
| 0.345211086 | 40.765 |
| 0.334292985 | 41.353 |
| 0.332408854 | 41.816 |
| 0.353023237 | 41.933 |
| 0.379305657 | 42.044 |
| 0.368742812 | 42.447 |
| 0.356801774 | 42.505 |
| 0.264398896 | 38.812 |
| 0.313135204 | 39.471 |
| 0.302443933 | 39.792 |
| 0.336354239 | 40.31 |
| 0.315490964 | 40.606 |
| 0.333307171 | 41.182 |
| 0.332161676 | 41.305 |
| 0.352798057 | 41.8 |
| 0.378505954 | 41.896 |
| 0.36805663 | 42.014 |
| 0.373984571 | 42.412 |
| 0.264074281 | 38.676 |
| 0.312724854 | 39.337 |
| 0.314401925 | 39.66 |
| 0.336189567 | 40.192 |
| 0.314430519 | 40.451 |
| 0.340181941 | 40.682 |
| 0.331271632 | 41.166 |
| 0.359703305 | 41.676 |
| 0.377665366 | 41.776 |
| 0.359562014 | 41.891 |
| 0.373367826 | 41.987 |
| 0.24536837 | 38.623 |
| 0.323140818 | 39.213 |
| 0.314023577 | 39.535 |
| 0.335799146 | 40.042 |
| 0.34217424 | 40.303 |
| 0.33216367 | 40.539 |
| 0.339130074 | 40.735 |
| 0.351134985 | 40.886 |
| 0.376815633 | 41.668 |
| 0.366595425 | 41.777 |
| 0.355015983 | 41.88 |
| 0.263249343 | 38.549 |
| 0.298873834 | 39.121 |
| 0.313590201 | 39.444 |
| 0.336103994 | 39.938 |
| 0.312812156 | 40.175 |
| 0.338398267 | 40.378 |
| 0.329677225 | 40.609 |
| 0.358021558 | 40.774 |
| 0.375968574 | 41.172 |
| 0.365743522 | 41.669 |
| 0.354346222 | 41.768 |
| 0.258747483 | 41.801 |
| 0.313202746 | 42.354 |
| 0.322217303 | 42.436 |
| 0.345832137 | 42.552 |
| 0.339707189 | 42.621 |
| 0.352321282 | 42.728 |
| 0.354976791 | 42.77 |
| 0.361621942 | 42.775 |
| 0.363708398 | 42.787 |
| 0.368461621 | 42.795 |
| 0.369433119 | 42.808 |
| 0.255536261 | 40.906 |
| 0.308212712 | 41.915 |
| 0.316678304 | 42.115 |
| 0.337682549 | 42.474 |
| 0.344085139 | 42.911 |
| 0.357223204 | 43.038 |
| 0.359853954 | 43.108 |
| 0.366811572 | 43.135 |
| 0.368914989 | 43.232 |
| 0.373678159 | 43.234 |
| 0.37465291 | 43.263 |
| 0.259031966 | 40.328 |
| 0.312321667 | 41.101 |
| 0.320874793 | 42.068 |
| 0.33777758 | 42.249 |
| 0.343799607 | 42.949 |
| 0.357831493 | 43.106 |
| 0.360725699 | 43.185 |
| 0.367760408 | 43.562 |
| 0.369980018 | 43.586 |
| 0.374977366 | 43.605 |
| 0.376034344 | 43.642 |
| 0.259972759 | 39.941 |
| 0.313482361 | 40.753 |
| 0.322102666 | 41.462 |
| 0.337170072 | 41.677 |
| 0.343466668 | 42.167 |
| 0.35715129 | 42.342 |
| 0.360725606 | 42.757 |
| 0.367773834 | 43.111 |
| 0.370404956 | 43.162 |
| 0.375403737 | 43.198 |
| 0.37649919 | 43.394 |
| 0.260552815 | 39.65 |
| 0.31423567 | 40.148 |
| 0.322882686 | 40.839 |
| 0.336402105 | 41.442 |
| 0.342935849 | 41.622 |
| 0.356909553 | 42.146 |
| 0.360271078 | 42.293 |
| 0.3675013 | 42.38 |
| 0.369994299 | 42.444 |
| 0.375563061 | 42.797 |
| 0.376718922 | 43.125 |
| 0.260557168 | 38.899 |
| 0.314343555 | 39.917 |
| 0.323334606 | 40.309 |
| 0.335205185 | 40.58 |
| 0.341870986 | 41.43 |
| 0.356016257 | 41.672 |
| 0.359550362 | 42.117 |
| 0.366923015 | 42.224 |
| 0.370199949 | 42.318 |
| 0.375440059 | 42.386 |
| 0.376670038 | 42.724 |
| 0.260574885 | 38.765 |
| 0.314369062 | 39.422 |
| 0.323073561 | 40.091 |
| 0.33474273 | 40.396 |
| 0.341894236 | 41.26 |
| 0.355649983 | 41.501 |
| 0.359328043 | 41.674 |
| 0.366931968 | 41.763 |
| 0.369662004 | 42.188 |
| 0.375035649 | 42.245 |
| 0.37641194 | 42.305 |
| 0.260447878 | 38.645 |
| 0.314222146 | 39.293 |
| 0.322966938 | 39.917 |
| 0.333718264 | 40.198 |
| 0.340411947 | 40.439 |
| 0.354617372 | 40.975 |
| 0.358448218 | 41.526 |
| 0.366807572 | 41.643 |
| 0.369697238 | 41.741 |
| 0.37515441 | 42.145 |
| 0.376634907 | 42.203 |
| 0.260666953 | 38.536 |
| 0.314637369 | 39.144 |
| 0.323405453 | 39.745 |
| 0.332712034 | 40.015 |
| 0.339892097 | 40.269 |
| 0.354345864 | 40.518 |
| 0.358205509 | 41.001 |
| 0.365996882 | 41.51 |
| 0.368963126 | 41.613 |
| 0.374515877 | 41.708 |
| 0.37609491 | 42.104 |
| 0.260309256 | 38.405 |
| 0.314275555 | 39.026 |
| 0.323200259 | 39.341 |
| 0.335727788 | 39.889 |
| 0.342083796 | 40.107 |
| 0.355317726 | 40.392 |
| 0.358893205 | 40.578 |
| 0.366425071 | 41.371 |
| 0.369257819 | 41.492 |
| 0.374644184 | 41.584 |
| 0.376146463 | 41.676 |
| 0.260318288 | 38.334 |
| 0.314275395 | 38.674 |
| 0.308638052 | 39.217 |
| 0.334821211 | 39.739 |
| 0.340732074 | 39.976 |
| 0.354391057 | 40.228 |
| 0.358072513 | 40.458 |
| 0.365588976 | 40.59 |
| 0.368537883 | 41.375 |
| 0.374007569 | 41.482 |
| 0.375525997 | 41.571 |
| 0.260488898 | 38.247 |
| 0.314531246 | 38.584 |
| 0.311627804 | 39.116 |
| 0.336449424 | 39.629 |
| 0.342326176 | 39.843 |
| 0.355177489 | 40.092 |
| 0.358489493 | 40.32 |
| 0.365968953 | 40.488 |
| 0.370285256 | 40.587 |
| 0.375541985 | 40.998 |
| 0.376990997 | 41.468 |